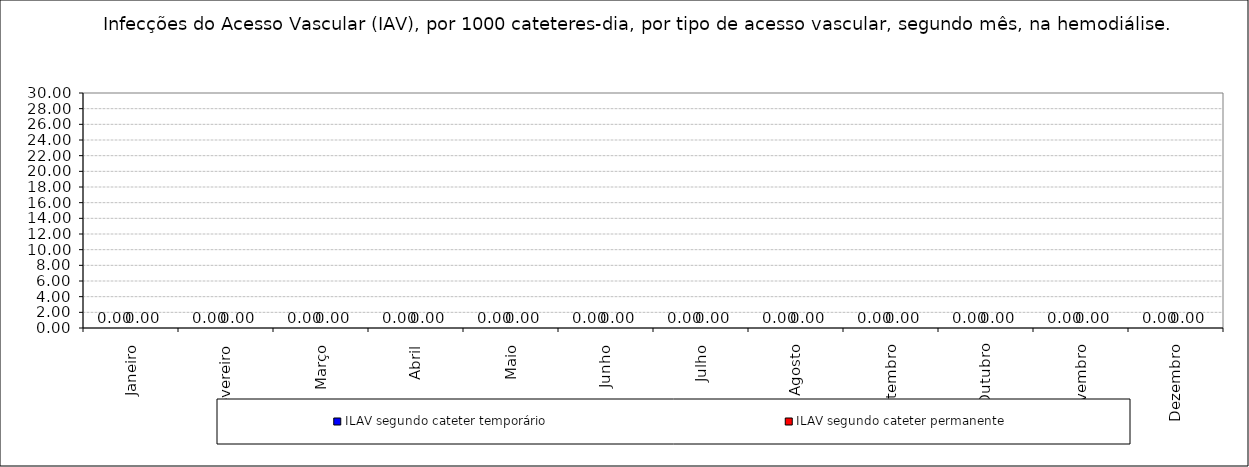
| Category | ILAV segundo cateter temporário | ILAV segundo cateter permanente |
|---|---|---|
| Janeiro | 0 | 0 |
| Fevereiro | 0 | 0 |
| Março | 0 | 0 |
| Abril | 0 | 0 |
| Maio | 0 | 0 |
| Junho | 0 | 0 |
| Julho | 0 | 0 |
| Agosto | 0 | 0 |
| Setembro | 0 | 0 |
| Outubro | 0 | 0 |
| Novembro | 0 | 0 |
| Dezembro | 0 | 0 |